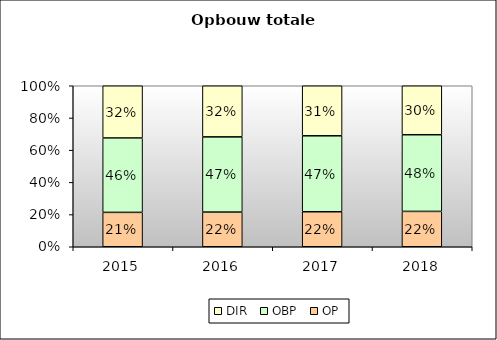
| Category | OP | OBP | DIR |
|---|---|---|---|
| 2015.0 | 0.214 | 0.462 | 0.324 |
| 2016.0 | 0.215 | 0.467 | 0.318 |
| 2017.0 | 0.217 | 0.472 | 0.311 |
| 2018.0 | 0.22 | 0.476 | 0.304 |